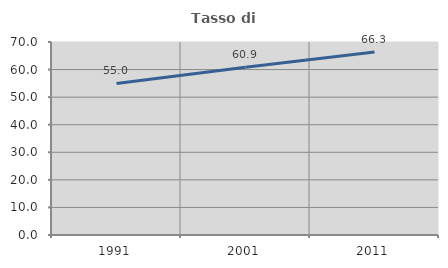
| Category | Tasso di occupazione   |
|---|---|
| 1991.0 | 54.968 |
| 2001.0 | 60.865 |
| 2011.0 | 66.342 |